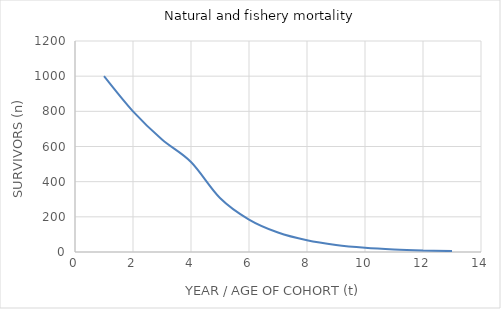
| Category | population size |
|---|---|
| 1.0 | 1000 |
| 2.0 | 800 |
| 3.0 | 640 |
| 4.0 | 512 |
| 5.0 | 307.2 |
| 6.0 | 184.32 |
| 7.0 | 110.592 |
| 8.0 | 66.355 |
| 9.0 | 39.813 |
| 10.0 | 23.888 |
| 11.0 | 14.333 |
| 12.0 | 8.6 |
| 13.0 | 5.16 |